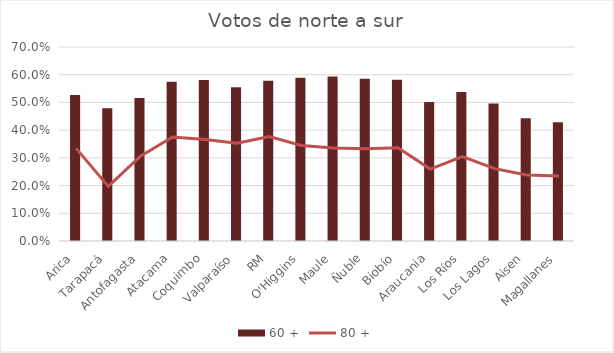
| Category | 60 + |
|---|---|
| Arica | 0.527 |
| Tarapacá | 0.479 |
| Antofagasta | 0.516 |
| Atacama | 0.575 |
| Coquimbo | 0.581 |
| Valparaíso | 0.555 |
| RM | 0.578 |
| O'Higgins | 0.589 |
| Maule | 0.594 |
| Ñuble | 0.586 |
| Biobío | 0.582 |
| Araucania | 0.502 |
| Los Ríos | 0.537 |
| Los Lagos | 0.496 |
| Aisen | 0.443 |
| Magallanes | 0.428 |